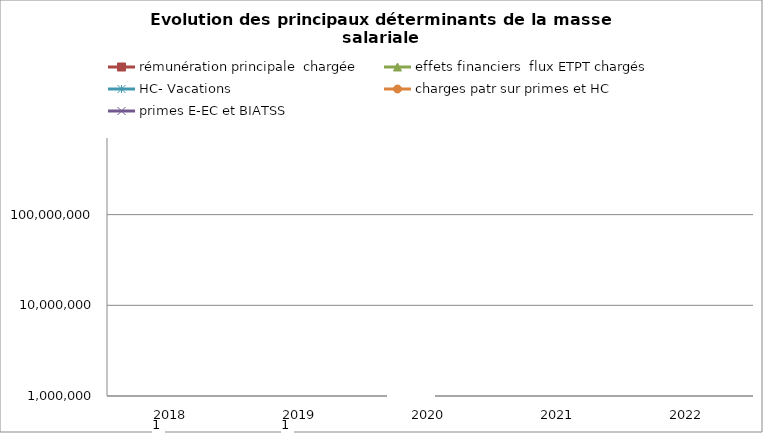
| Category | rémunération principale  chargée | effets financiers  flux ETPT chargés | HC- Vacations | charges patr sur primes et HC | primes E-EC et BIATSS |
|---|---|---|---|---|---|
| 2018.0 | 0 | 1 | 0 | 0 | 0 |
| 2019.0 | 0 | 1 | 0 | 0 | 0 |
| 2020.0 | 0 | 0 | 0 | 0 | 0 |
| 2021.0 | 0 | 0 | 0 | 0 | 0 |
| 2022.0 | 0 | 0 | 0 | 0 | 0 |